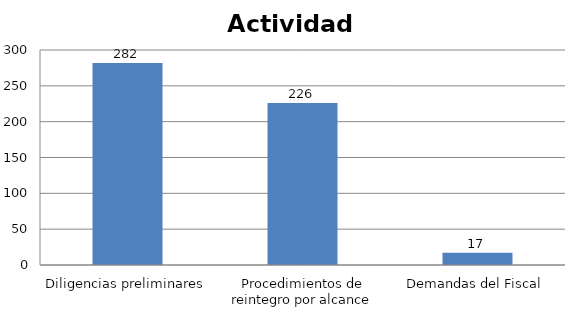
| Category | Series 0 |
|---|---|
| Diligencias preliminares | 282 |
| Procedimientos de reintegro por alcance | 226 |
| Demandas del Fiscal | 17 |